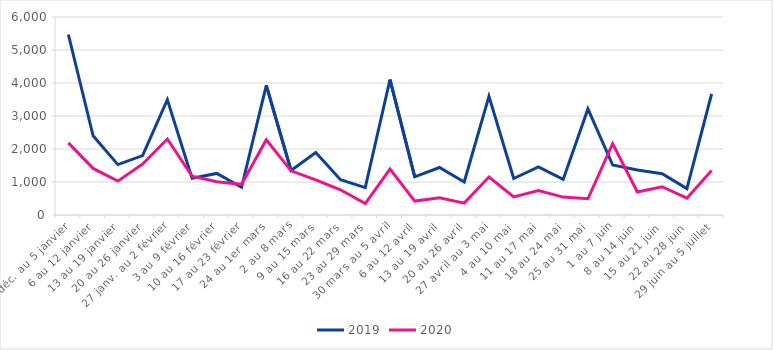
| Category | 2019 | 2020 |
|---|---|---|
| 30 déc. au 5 janvier | 5470 | 2185 |
| 6 au 12 janvier | 2400 | 1412 |
| 13 au 19 janvier | 1527 | 1027 |
| 20 au 26 janvier | 1798 | 1546 |
| 27 janv. au 2 février | 3495 | 2302 |
| 3 au 9 février | 1116 | 1177 |
| 10 au 16 février | 1260 | 1010 |
| 17 au 23 février | 841 | 929 |
| 24 au 1er mars | 3928 | 2282 |
| 2 au 8 mars | 1349 | 1339 |
| 9 au 15 mars | 1893 | 1065 |
| 16 au 22 mars | 1068 | 764 |
| 23 au 29 mars | 828 | 346 |
| 30 mars au 5 avril | 4105 | 1391 |
| 6 au 12 avril | 1156 | 422 |
| 13 au 19 avril | 1440 | 519 |
| 20 au 26 avril | 1002 | 359 |
| 27 avril au 3 mai | 3595 | 1151 |
| 4 au 10 mai | 1106 | 547 |
| 11 au 17 mai | 1456 | 744 |
| 18 au 24 mai | 1078 | 543 |
| 25 au 31 mai | 3215 | 492 |
| 1 au 7 juin | 1515 | 2160 |
| 8 au 14 juin | 1366 | 696 |
| 15 au 21 juin | 1252 | 857 |
| 22 au 28 juin | 799 | 509 |
| 29 juin au 5 juillet | 3667 | 1347 |